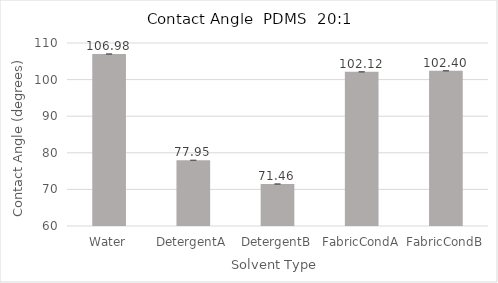
| Category | Series 0 |
|---|---|
| Water | 106.98 |
| DetergentA | 77.95 |
| DetergentB | 71.46 |
| FabricCondA | 102.117 |
| FabricCondB | 102.403 |